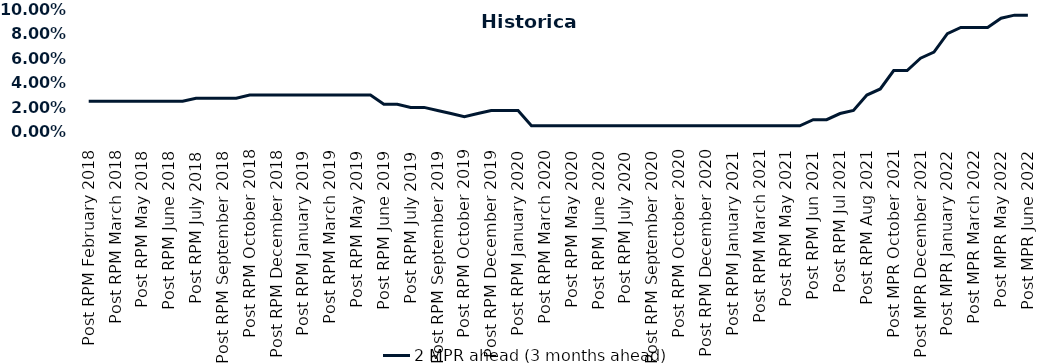
| Category | 2 MPR ahead (3 months ahead) |
|---|---|
| Post RPM February 2018 | 0.025 |
| Pre RPM March 2018 | 0.025 |
| Post RPM March 2018 | 0.025 |
| Pre RPM May 2018 | 0.025 |
| Post RPM May 2018 | 0.025 |
| Pre RPM June 2018 | 0.025 |
| Post RPM June 2018 | 0.025 |
| Pre RPM July 2018 | 0.025 |
| Post RPM July 2018 | 0.028 |
| Pre RPM September 2018 | 0.028 |
| Post RPM September 2018 | 0.028 |
| Pre RPM October 2018 | 0.028 |
| Post RPM October 2018 | 0.03 |
| Pre RPM December 2018 | 0.03 |
| Post RPM December 2018 | 0.03 |
| Pre RPM January 2019 | 0.03 |
| Post RPM January 2019 | 0.03 |
| Pre RPM March 2019 | 0.03 |
| Post RPM March 2019 | 0.03 |
| Pre RPM May 2019 | 0.03 |
| Post RPM May 2019 | 0.03 |
| Pre RPM June 2019 | 0.03 |
| Post RPM June 2019 | 0.022 |
| Pre RPM July 2019 | 0.022 |
| Post RPM July 2019 | 0.02 |
| Pre RPM September 2019 | 0.02 |
| Post RPM September 2019 | 0.018 |
| Pre RPM October 2019 | 0.015 |
| Post RPM October 2019 | 0.012 |
| Pre RPM December 2019 | 0.015 |
| Post RPM December 2019 | 0.018 |
| Pre RPM January 2020 | 0.018 |
| Post RPM January 2020 | 0.018 |
| Pre RPM March 2020 | 0.005 |
| Post RPM March 2020 | 0.005 |
| Pre RPM May 2020 | 0.005 |
| Post RPM May 2020 | 0.005 |
| Pre RPM June 2020 | 0.005 |
| Post RPM June 2020 | 0.005 |
| Pre RPM July 2020 | 0.005 |
| Post RPM July 2020 | 0.005 |
| Pre RPM September 2020 | 0.005 |
| Post RPM September 2020 | 0.005 |
| Pre RPM October 2020 | 0.005 |
| Post RPM October 2020 | 0.005 |
| Pre RPM December 2020 | 0.005 |
|  Post RPM December 2020 | 0.005 |
| Pre RPM January 2021 | 0.005 |
| Post RPM January 2021 | 0.005 |
|  Pre RPM March 2021 | 0.005 |
|  Post RPM March 2021 | 0.005 |
|  Pre RPM May 2021 | 0.005 |
|  Post RPM May 2021 | 0.005 |
|  Pre RPM Jun 2021 | 0.005 |
|   Post RPM Jun 2021 | 0.01 |
| Pre RPM Jul 2021 | 0.01 |
|  Post RPM Jul 2021 | 0.015 |
| Pre RPM Aug 2021 | 0.018 |
|  Post RPM Aug 2021 | 0.03 |
| Pre MPR October 2021 | 0.035 |
| Post MPR October 2021 | 0.05 |
| Pre MPR December 2021 | 0.05 |
| Post MPR December 2021 | 0.06 |
| Pre MPR January 2022 | 0.065 |
| Post MPR January 2022 | 0.08 |
| Pre MPR March 2022 | 0.085 |
| Post MPR March 2022 | 0.085 |
| Pre MPR May 2022 | 0.085 |
| Post MPR May 2022 | 0.092 |
| Pre MPR June 2022 | 0.095 |
| Post MPR June 2022 | 0.095 |